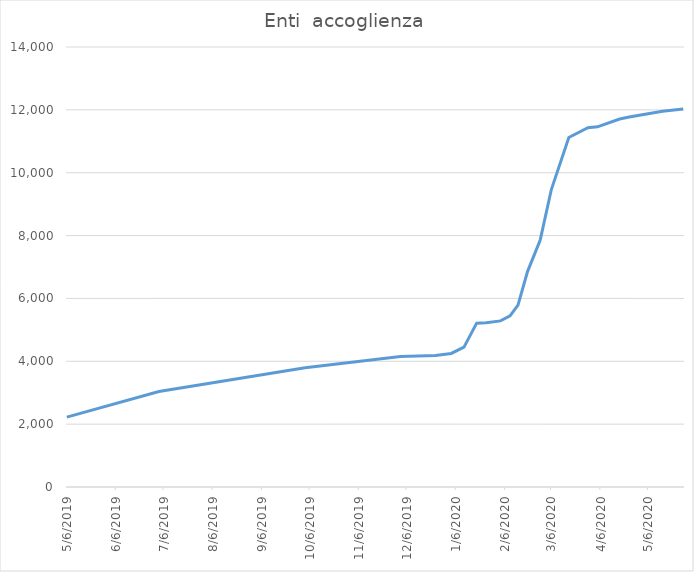
| Category | Enti  accoglienza |
|---|---|
| 5/6/19 | 2223 |
| 7/3/19 | 3038 |
| 10/3/19 | 3793 |
| 12/2/19 | 4149 |
| 12/24/19 | 4181 |
| 1/3/20 | 4249 |
| 1/11/20 | 4450 |
| 1/19/20 | 5214 |
| 1/25/20 | 5229 |
| 2/3/20 | 5285 |
| 2/9/20 | 5443 |
| 2/14/20 | 5787 |
| 2/20/20 | 6854 |
| 2/28/20 | 7861 |
| 3/6/20 | 9465 |
| 3/17/20 | 11122 |
| 3/29/20 | 11433 |
| 4/4/20 | 11460 |
| 4/18/20 | 11710 |
| 4/24/20 | 11770 |
| 5/15/20 | 11953 |
| 5/28/20 | 12025 |